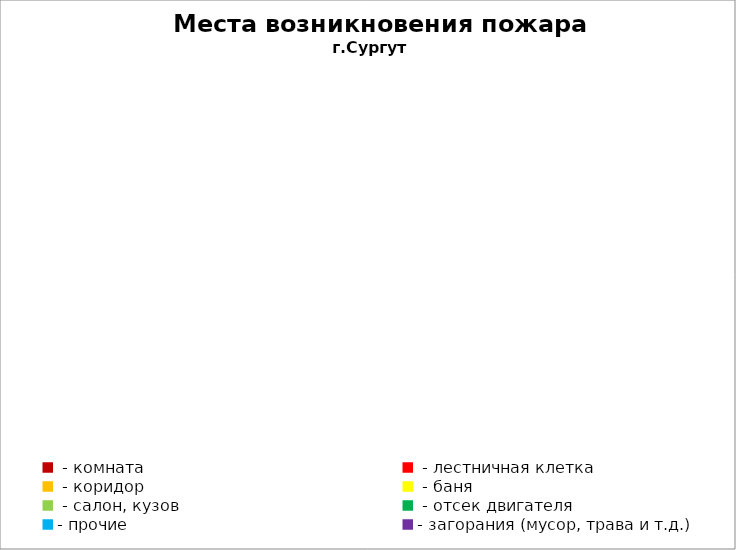
| Category | Места возникновения пожара |
|---|---|
|  - комната | 35 |
|  - лестничная клетка | 7 |
|  - коридор | 7 |
|  - баня | 13 |
|  - салон, кузов | 19 |
|  - отсек двигателя | 33 |
| - прочие | 113 |
| - загорания (мусор, трава и т.д.)  | 93 |